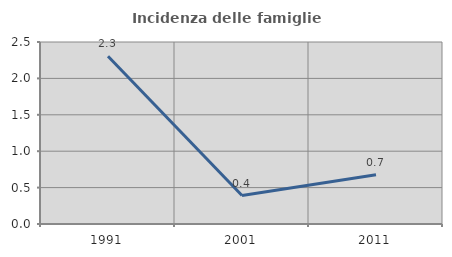
| Category | Incidenza delle famiglie numerose |
|---|---|
| 1991.0 | 2.304 |
| 2001.0 | 0.391 |
| 2011.0 | 0.678 |